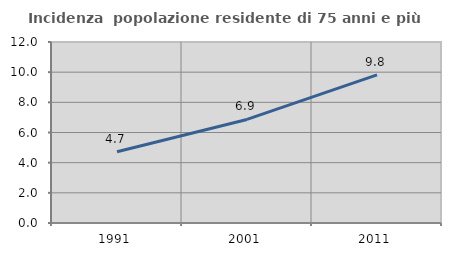
| Category | Incidenza  popolazione residente di 75 anni e più |
|---|---|
| 1991.0 | 4.718 |
| 2001.0 | 6.865 |
| 2011.0 | 9.825 |